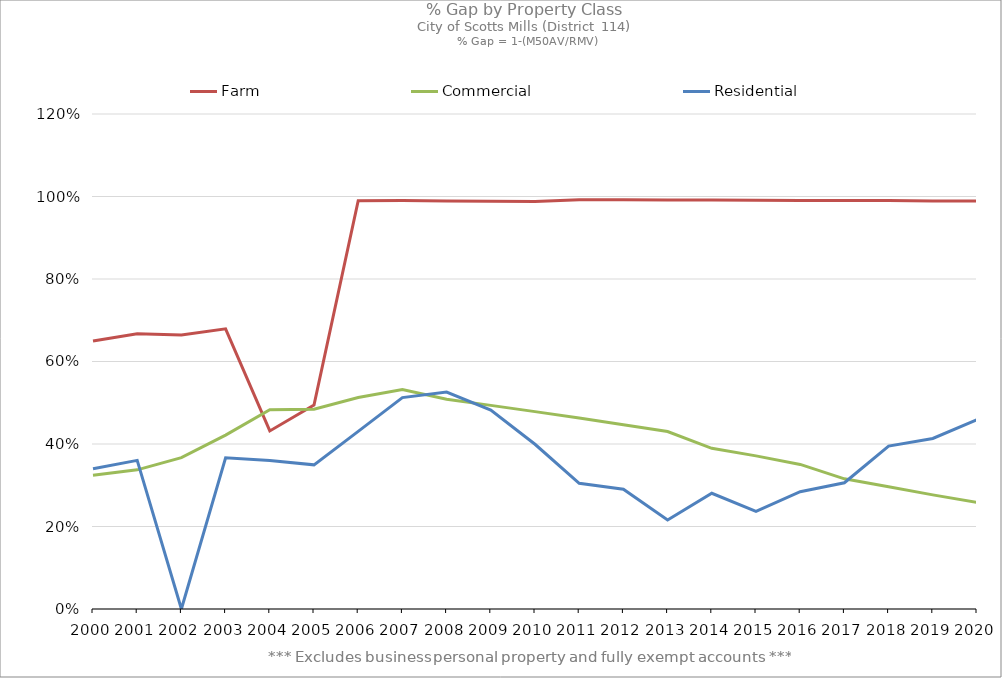
| Category | Farm | Commercial | Residential |
|---|---|---|---|
| 2000.0 | 0.65 | 0.324 | 0.34 |
| 2001.0 | 0.667 | 0.337 | 0.36 |
| 2002.0 | 0.664 | 0.367 | 0 |
| 2003.0 | 0.679 | 0.422 | 0.366 |
| 2004.0 | 0.432 | 0.483 | 0.36 |
| 2005.0 | 0.494 | 0.484 | 0.349 |
| 2006.0 | 0.99 | 0.513 | 0.431 |
| 2007.0 | 0.99 | 0.532 | 0.512 |
| 2008.0 | 0.989 | 0.508 | 0.526 |
| 2009.0 | 0.989 | 0.494 | 0.482 |
| 2010.0 | 0.988 | 0.478 | 0.399 |
| 2011.0 | 0.992 | 0.463 | 0.305 |
| 2012.0 | 0.992 | 0.447 | 0.29 |
| 2013.0 | 0.991 | 0.43 | 0.216 |
| 2014.0 | 0.991 | 0.389 | 0.281 |
| 2015.0 | 0.991 | 0.371 | 0.237 |
| 2016.0 | 0.991 | 0.351 | 0.284 |
| 2017.0 | 0.991 | 0.316 | 0.306 |
| 2018.0 | 0.99 | 0.296 | 0.395 |
| 2019.0 | 0.989 | 0.277 | 0.413 |
| 2020.0 | 0.989 | 0.258 | 0.459 |